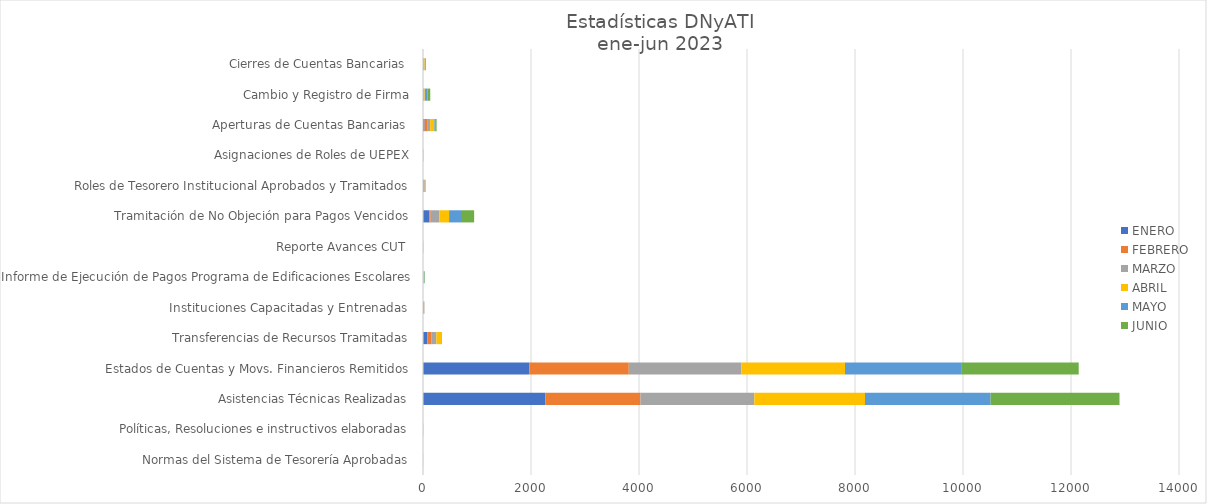
| Category | ENERO | FEBRERO | MARZO | ABRIL | MAYO | JUNIO |
|---|---|---|---|---|---|---|
| Normas del Sistema de Tesorería Aprobadas | 0 | 0 | 1 | 0 | 0 | 1 |
| Políticas, Resoluciones e instructivos elaboradas | 0 | 0 | 4 | 1 | 1 | 0 |
| Asistencias Técnicas Realizadas | 2266 | 1761 | 2109 | 2049 | 2326 | 2387 |
| Estados de Cuentas y Movs. Financieros Remitidos | 1971 | 1840 | 2083 | 1921 | 2164 | 2164 |
| Transferencias de Recursos Tramitadas | 79 | 81 | 88 | 87 | 11 | 0 |
| Instituciones Capacitadas y Entrenadas  | 1 | 22 | 1 | 0 | 2 | 0 |
| Informe de Ejecución de Pagos Programa de Edificaciones Escolares | 1 | 8 | 8 | 3 | 7 | 8 |
| Reporte Avances CUT  | 1 | 1 | 1 | 1 | 1 | 1 |
| Tramitación de No Objeción para Pagos Vencidos | 120 | 23 | 161 | 179 | 221 | 243 |
| Roles de Tesorero Institucional Aprobados y Tramitados | 13 | 12 | 11 | 5 | 4 | 5 |
| Asignaciones de Roles de UEPEX | 2 | 2 | 2 | 0 | 1 | 0 |
| Aperturas de Cuentas Bancarias  | 29 | 47 | 57 | 78 | 27 | 14 |
| Cambio y Registro de Firma | 10 | 10 | 10 | 8 | 44 | 52 |
| Cierres de Cuentas Bancarias  | 9 | 10 | 10 | 8 | 9 | 10 |